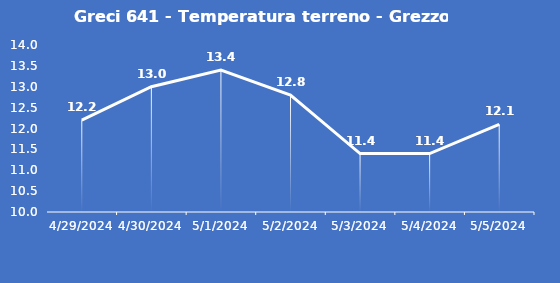
| Category | Greci 641 - Temperatura terreno - Grezzo (°C) |
|---|---|
| 4/29/24 | 12.2 |
| 4/30/24 | 13 |
| 5/1/24 | 13.4 |
| 5/2/24 | 12.8 |
| 5/3/24 | 11.4 |
| 5/4/24 | 11.4 |
| 5/5/24 | 12.1 |